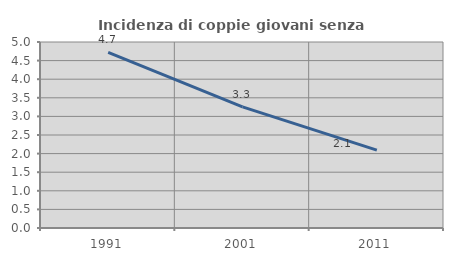
| Category | Incidenza di coppie giovani senza figli |
|---|---|
| 1991.0 | 4.719 |
| 2001.0 | 3.256 |
| 2011.0 | 2.094 |